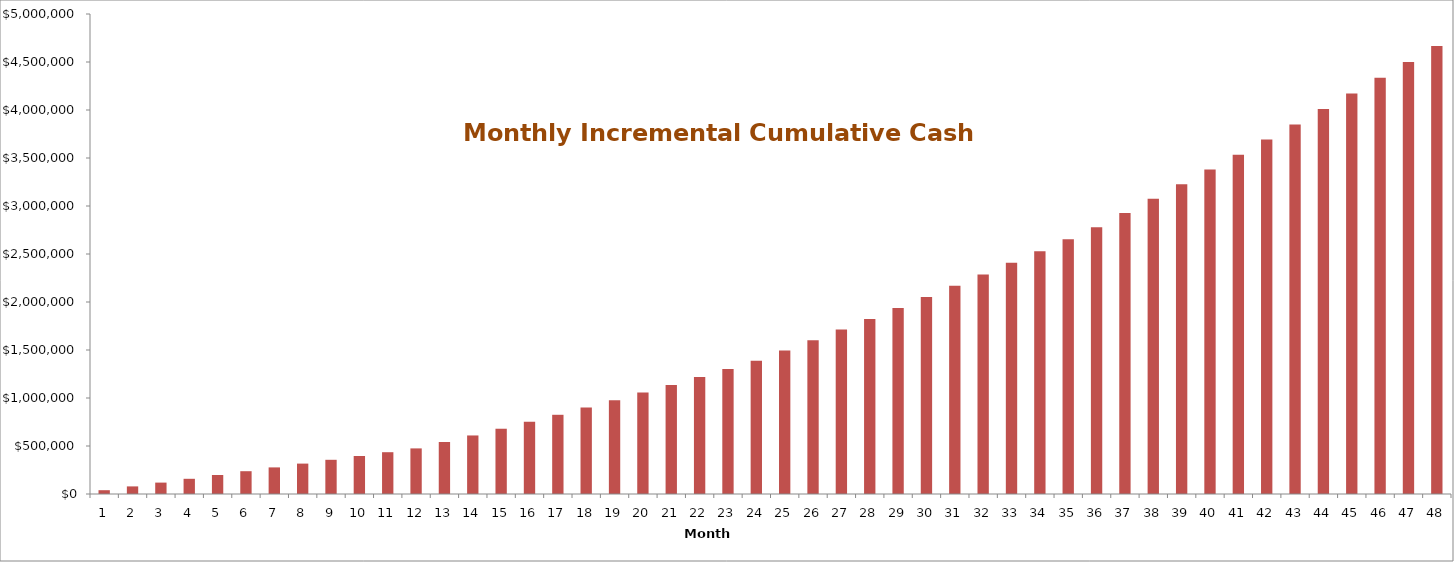
| Category | Monthly Cumulative Cash Flow |
|---|---|
| 0 | 39583.333 |
| 1 | 79166.667 |
| 2 | 118750 |
| 3 | 158333.333 |
| 4 | 197916.667 |
| 5 | 237500 |
| 6 | 277083.333 |
| 7 | 316666.667 |
| 8 | 356250 |
| 9 | 395833.333 |
| 10 | 435416.667 |
| 11 | 475000 |
| 12 | 541535.417 |
| 13 | 609814.583 |
| 14 | 679837.5 |
| 15 | 751604.167 |
| 16 | 825114.583 |
| 17 | 900368.75 |
| 18 | 977366.667 |
| 19 | 1056108.333 |
| 20 | 1136593.75 |
| 21 | 1218822.917 |
| 22 | 1302795.833 |
| 23 | 1388512.5 |
| 24 | 1494764.583 |
| 25 | 1602760.417 |
| 26 | 1712500 |
| 27 | 1823983.333 |
| 28 | 1937210.417 |
| 29 | 2052181.25 |
| 30 | 2168895.833 |
| 31 | 2287354.167 |
| 32 | 2407556.25 |
| 33 | 2529502.083 |
| 34 | 2653191.667 |
| 35 | 2778625 |
| 36 | 2926427.083 |
| 37 | 3075972.917 |
| 38 | 3227262.5 |
| 39 | 3380295.833 |
| 40 | 3535072.917 |
| 41 | 3691593.75 |
| 42 | 3849858.333 |
| 43 | 4009866.667 |
| 44 | 4171618.75 |
| 45 | 4335114.583 |
| 46 | 4500354.167 |
| 47 | 4667337.5 |